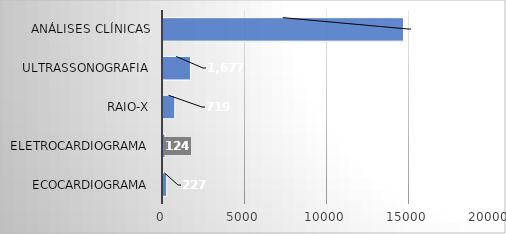
| Category | Series 0 |
|---|---|
| ECOCARDIOGRAMA | 227 |
| ELETROCARDIOGRAMA | 124 |
| RAIO-X | 719 |
| ULTRASSONOGRAFIA | 1677 |
| ANÁLISES CLÍNICAS | 14665 |